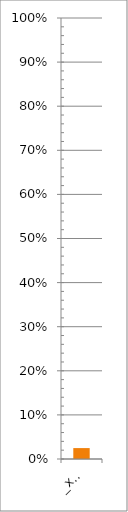
| Category | Series 0 |
|---|---|
| 0 | 0.025 |